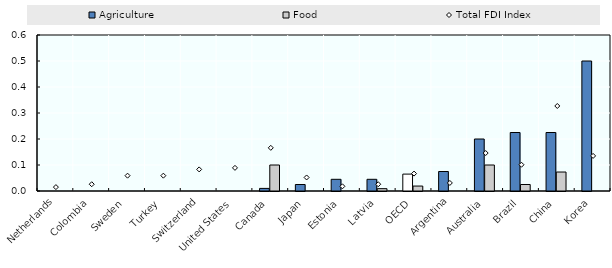
| Category | Agriculture | Food |
|---|---|---|
| Netherlands | 0 | 0 |
| Colombia | 0 | 0 |
| Sweden | 0 | 0 |
| Turkey | 0 | 0 |
| Switzerland | 0 | 0 |
| United States | 0 | 0 |
| Canada | 0.01 | 0.1 |
| Japan | 0.025 | 0 |
| Estonia | 0.045 | 0 |
| Latvia | 0.045 | 0.009 |
| OECD | 0.065 | 0.019 |
| Argentina | 0.075 | 0 |
| Australia | 0.2 | 0.1 |
| Brazil | 0.225 | 0.025 |
| China | 0.225 | 0.073 |
| Korea | 0.5 | 0 |